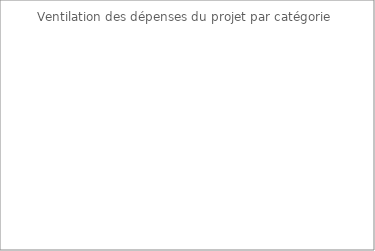
| Category | Series 0 |
|---|---|
| UI 1 | 0 |
| UI 2 | 0 |
| UI 3 | 0 |
| UI 4 | 0 |
| UI 5 | 0 |
| Ensemble du projet | 0 |